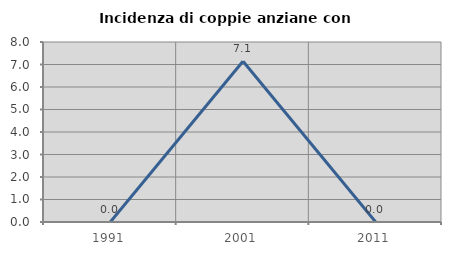
| Category | Incidenza di coppie anziane con figli |
|---|---|
| 1991.0 | 0 |
| 2001.0 | 7.143 |
| 2011.0 | 0 |